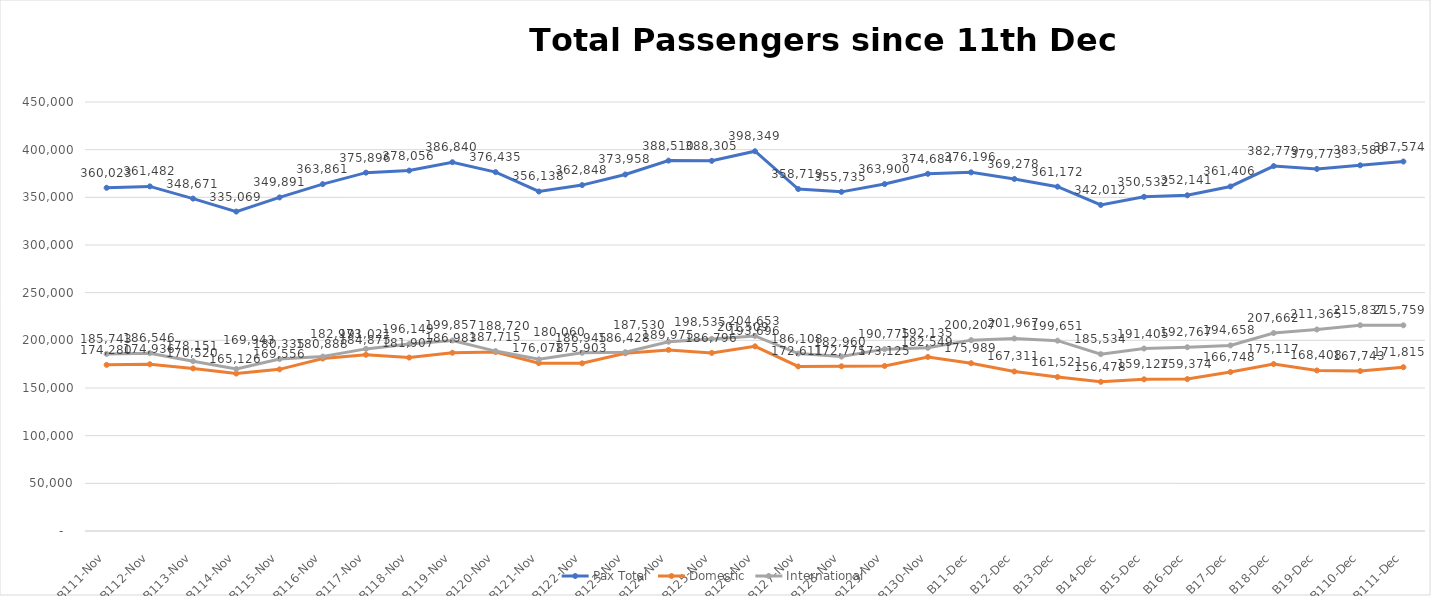
| Category | Pax Total | Domestic | International |
|---|---|---|---|
| 2023-11-11 | 360023 | 174280 | 185743 |
| 2023-11-12 | 361482 | 174936 | 186546 |
| 2023-11-13 | 348671 | 170520 | 178151 |
| 2023-11-14 | 335069 | 165126 | 169943 |
| 2023-11-15 | 349891 | 169556 | 180335 |
| 2023-11-16 | 363861 | 180888 | 182973 |
| 2023-11-17 | 375896 | 184875 | 191021 |
| 2023-11-18 | 378056 | 181907 | 196149 |
| 2023-11-19 | 386840 | 186983 | 199857 |
| 2023-11-20 | 376435 | 187715 | 188720 |
| 2023-11-21 | 356138 | 176078 | 180060 |
| 2023-11-22 | 362848 | 175903 | 186945 |
| 2023-11-23 | 373958 | 186428 | 187530 |
| 2023-11-24 | 388510 | 189975 | 198535 |
| 2023-11-25 | 388305 | 186796 | 201509 |
| 2023-11-26 | 398349 | 193696 | 204653 |
| 2023-11-27 | 358719 | 172611 | 186108 |
| 2023-11-28 | 355735 | 172775 | 182960 |
| 2023-11-29 | 363900 | 173125 | 190775 |
| 2023-11-30 | 374684 | 182549 | 192135 |
| 2023-12-01 | 376196 | 175989 | 200207 |
| 2023-12-02 | 369278 | 167311 | 201967 |
| 2023-12-03 | 361172 | 161521 | 199651 |
| 2023-12-04 | 342012 | 156478 | 185534 |
| 2023-12-05 | 350532 | 159127 | 191405 |
| 2023-12-06 | 352141 | 159374 | 192767 |
| 2023-12-07 | 361406 | 166748 | 194658 |
| 2023-12-08 | 382779 | 175117 | 207662 |
| 2023-12-09 | 379773 | 168408 | 211365 |
| 2023-12-10 | 383580 | 167743 | 215837 |
| 2023-12-11 | 387574 | 171815 | 215759 |